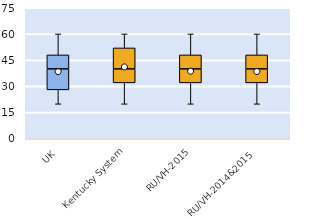
| Category | 25th | 50th | 75th |
|---|---|---|---|
| UK | 28 | 12 | 8 |
| Kentucky System | 32 | 8 | 12 |
| RU/VH-2015 | 32 | 8 | 8 |
| RU/VH-2014&2015 | 32 | 8 | 8 |